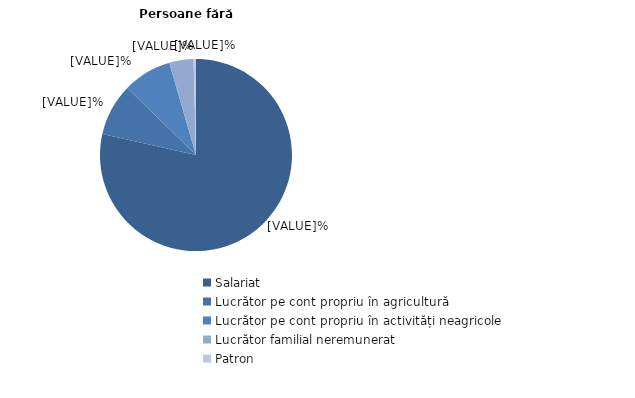
| Category | Persoane fără dizabilități |
|---|---|
| Salariat | 78.5 |
| Lucrător pe cont propriu în agricultură | 8.8 |
| Lucrător pe cont propriu în activități neagricole | 8.2 |
| Lucrător familial neremunerat | 4.1 |
| Patron | 0.4 |